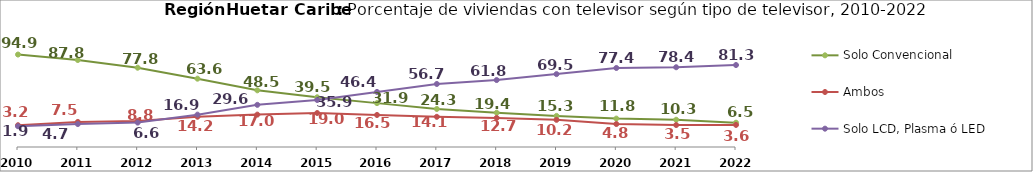
| Category | Solo Convencional | Ambos | Solo LCD, Plasma ó LED |
|---|---|---|---|
| 2010.0 | 94.866 | 3.214 | 1.92 |
| 2011.0 | 87.76 | 7.491 | 4.749 |
| 2012.0 | 77.792 | 8.786 | 6.632 |
| 2013.0 | 63.566 | 14.236 | 16.948 |
| 2014.0 | 48.476 | 16.986 | 29.635 |
| 2015.0 | 39.459 | 19.046 | 35.918 |
| 2016.0 | 31.876 | 16.511 | 46.406 |
| 2017.0 | 24.328 | 14.12 | 56.694 |
| 2018.0 | 19.448 | 12.712 | 61.799 |
| 2019.0 | 15.297 | 10.224 | 69.485 |
| 2020.0 | 11.831 | 4.767 | 77.43 |
| 2021.0 | 10.319 | 3.468 | 78.399 |
| 2022.0 | 6.504 | 3.637 | 81.261 |